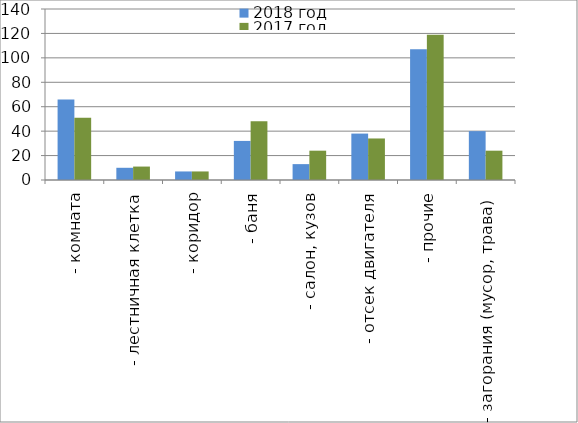
| Category | 2018 год | 2017 год |
|---|---|---|
|  - комната | 66 | 51 |
|  - лестничная клетка | 10 | 11 |
|  - коридор | 7 | 7 |
|  - баня | 32 | 48 |
|  - салон, кузов | 13 | 24 |
|  - отсек двигателя | 38 | 34 |
| - прочие | 107 | 119 |
| - загорания (мусор, трава)  | 40 | 24 |